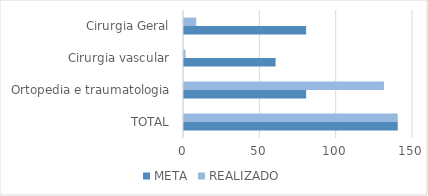
| Category | META | REALIZADO |
|---|---|---|
| TOTAL | 140 | 140 |
| Ortopedia e traumatologia | 80 | 131 |
| Cirurgia vascular | 60 | 1 |
| Cirurgia Geral | 80 | 8 |